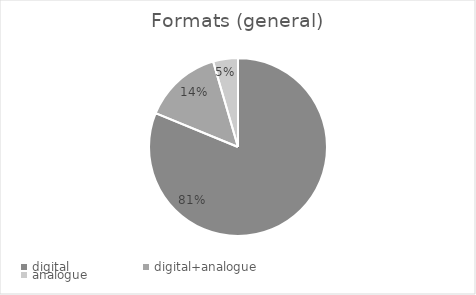
| Category | % |
|---|---|
| digital | 0.812 |
| digital+analogue | 0.143 |
| analogue | 0.045 |